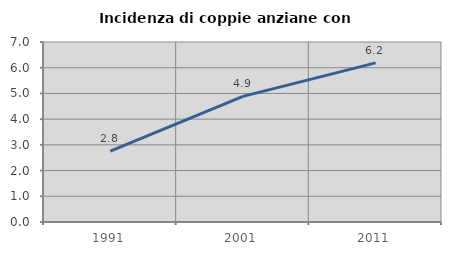
| Category | Incidenza di coppie anziane con figli |
|---|---|
| 1991.0 | 2.754 |
| 2001.0 | 4.885 |
| 2011.0 | 6.189 |